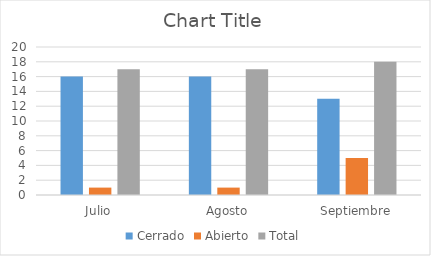
| Category | Cerrado | Abierto | Total |
|---|---|---|---|
| Julio | 16 | 1 | 17 |
| Agosto | 16 | 1 | 17 |
| Septiembre | 13 | 5 | 18 |